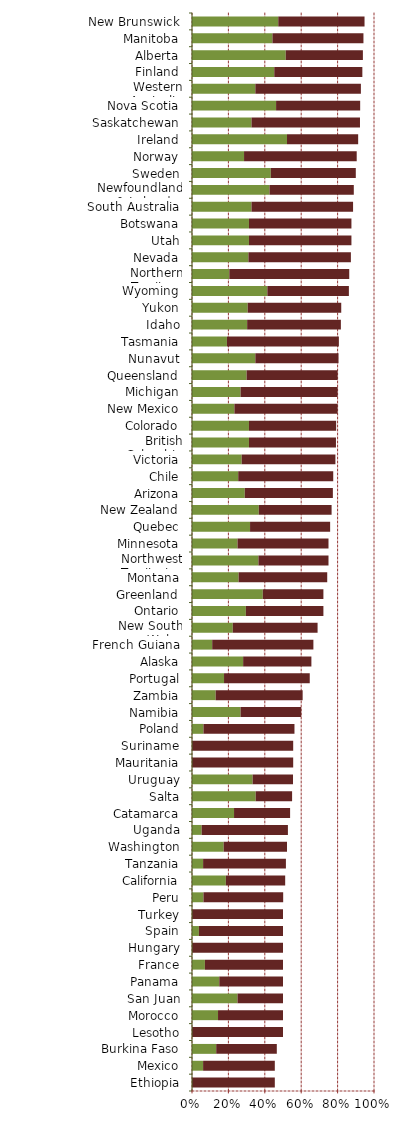
| Category | Series 0 | Series 1 |
|---|---|---|
| Ethiopia | 0 | 0.455 |
| Mexico | 0.061 | 0.394 |
| Burkina Faso | 0.133 | 0.333 |
| Lesotho | 0 | 0.5 |
| Morocco | 0.143 | 0.357 |
| San Juan | 0.25 | 0.25 |
| Panama | 0.15 | 0.35 |
| France | 0.071 | 0.429 |
| Hungary | 0 | 0.5 |
| Spain | 0.038 | 0.462 |
| Turkey | 0 | 0.5 |
| Peru | 0.063 | 0.438 |
| California | 0.186 | 0.326 |
| Tanzania | 0.061 | 0.455 |
| Washington | 0.174 | 0.348 |
| Uganda | 0.053 | 0.474 |
| Catamarca | 0.231 | 0.308 |
| Salta | 0.35 | 0.2 |
| Uruguay | 0.333 | 0.222 |
| Mauritania | 0 | 0.556 |
| Suriname | 0 | 0.556 |
| Poland | 0.063 | 0.5 |
| Namibia | 0.267 | 0.333 |
| Zambia | 0.13 | 0.478 |
| Portugal | 0.176 | 0.471 |
| Alaska | 0.281 | 0.375 |
| French Guiana | 0.111 | 0.556 |
| New South Wales | 0.224 | 0.466 |
| Ontario | 0.296 | 0.426 |
| Greenland | 0.389 | 0.333 |
| Montana | 0.256 | 0.487 |
| Northwest Territories | 0.365 | 0.385 |
| Minnesota | 0.25 | 0.5 |
| Quebec | 0.319 | 0.44 |
| New Zealand | 0.367 | 0.4 |
| Arizona | 0.29 | 0.484 |
| Chile | 0.254 | 0.522 |
| Victoria | 0.273 | 0.515 |
| British Columbia | 0.313 | 0.478 |
| Colorado | 0.313 | 0.479 |
| New Mexico | 0.233 | 0.567 |
| Michigan | 0.267 | 0.533 |
| Queensland | 0.3 | 0.5 |
| Nunavut | 0.348 | 0.457 |
| Tasmania | 0.192 | 0.615 |
| Idaho | 0.303 | 0.515 |
| Yukon | 0.306 | 0.514 |
| Wyoming | 0.414 | 0.448 |
| Northern Territory | 0.205 | 0.659 |
| Nevada | 0.31 | 0.563 |
| Utah | 0.313 | 0.563 |
| Botswana | 0.313 | 0.563 |
| South Australia | 0.327 | 0.558 |
| Newfoundland & Labrador | 0.426 | 0.463 |
| Sweden | 0.433 | 0.467 |
| Norway | 0.286 | 0.619 |
| Ireland | 0.522 | 0.391 |
| Saskatchewan | 0.327 | 0.596 |
| Nova Scotia | 0.462 | 0.462 |
| Western Australia | 0.348 | 0.58 |
| Finland | 0.452 | 0.484 |
| Alberta | 0.515 | 0.424 |
| Manitoba | 0.442 | 0.5 |
| New Brunswick | 0.474 | 0.474 |